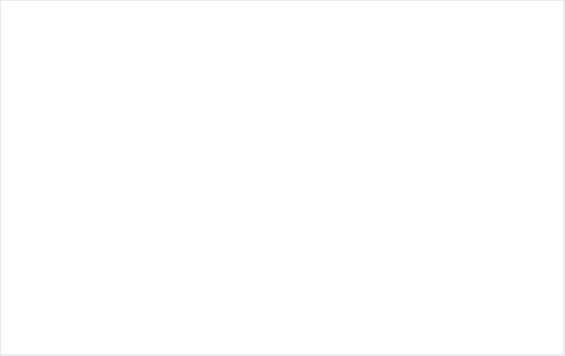
| Category | Total |
|---|---|
| Supplier 1 | 3.25 |
| Supplier 2 | 1.938 |
| Supplier 3 | 2.781 |